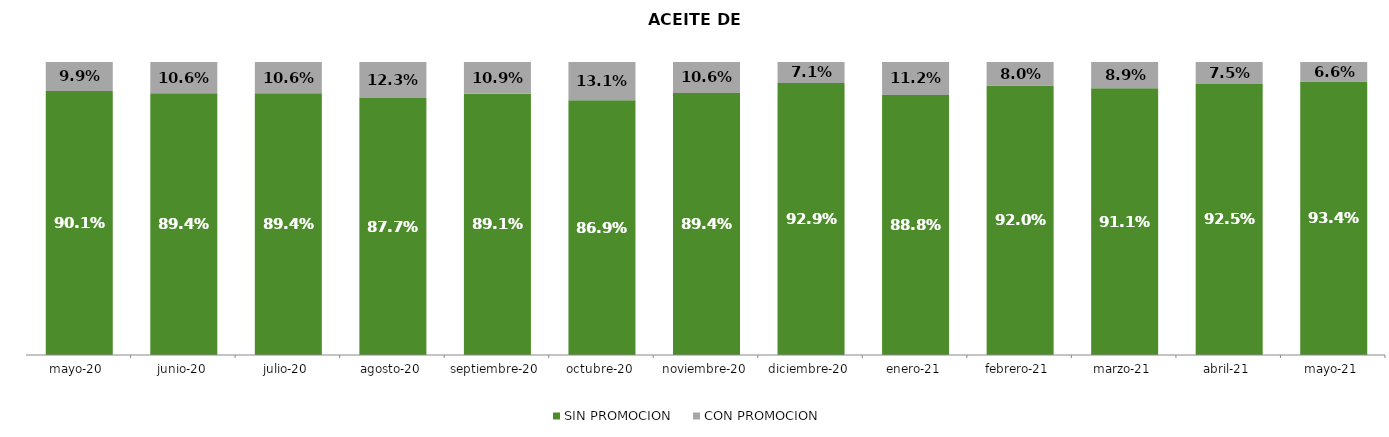
| Category | SIN PROMOCION   | CON PROMOCION   |
|---|---|---|
| 2020-05-01 | 0.901 | 0.099 |
| 2020-06-01 | 0.894 | 0.106 |
| 2020-07-01 | 0.894 | 0.106 |
| 2020-08-01 | 0.877 | 0.123 |
| 2020-09-01 | 0.891 | 0.109 |
| 2020-10-01 | 0.869 | 0.131 |
| 2020-11-01 | 0.894 | 0.106 |
| 2020-12-01 | 0.929 | 0.071 |
| 2021-01-01 | 0.888 | 0.112 |
| 2021-02-01 | 0.92 | 0.08 |
| 2021-03-01 | 0.911 | 0.089 |
| 2021-04-01 | 0.925 | 0.075 |
| 2021-05-01 | 0.934 | 0.066 |